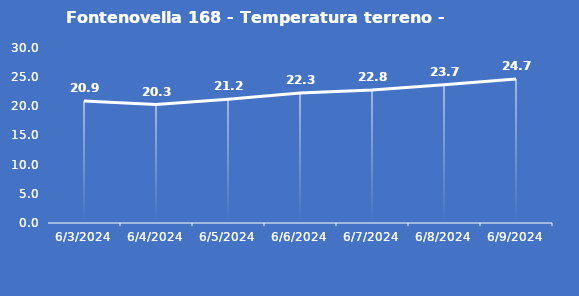
| Category | Fontenovella 168 - Temperatura terreno - Grezzo (°C) |
|---|---|
| 6/3/24 | 20.9 |
| 6/4/24 | 20.3 |
| 6/5/24 | 21.2 |
| 6/6/24 | 22.3 |
| 6/7/24 | 22.8 |
| 6/8/24 | 23.7 |
| 6/9/24 | 24.7 |